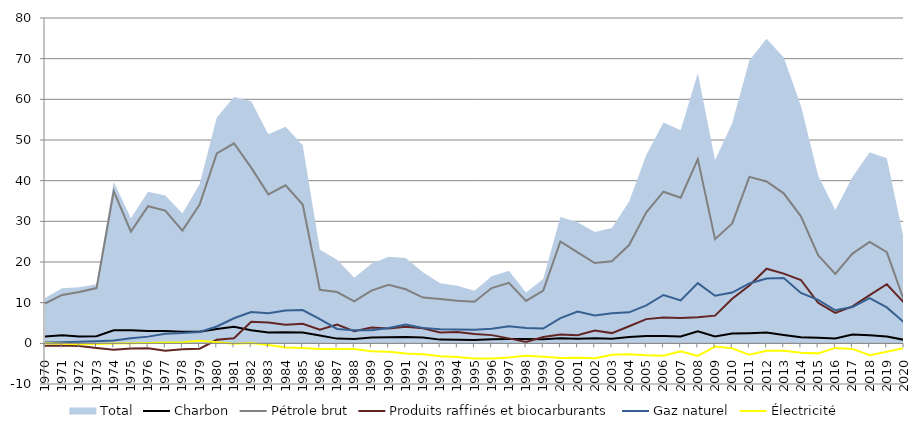
| Category | Charbon | Pétrole brut | Produits raffinés et biocarburants | Gaz naturel | Électricité |
|---|---|---|---|---|---|
| 1970.0 | 1.688 | 9.794 | -0.571 | 0.22 | -0.005 |
| 1971.0 | 1.994 | 11.895 | -0.561 | 0.287 | -0.072 |
| 1972.0 | 1.675 | 12.647 | -0.674 | 0.384 | -0.256 |
| 1973.0 | 1.758 | 13.589 | -1.136 | 0.482 | -0.153 |
| 1974.0 | 3.224 | 37.426 | -1.598 | 0.673 | -0.042 |
| 1975.0 | 3.24 | 27.462 | -1.264 | 1.271 | 0.023 |
| 1976.0 | 3.003 | 33.721 | -1.204 | 1.649 | 0.091 |
| 1977.0 | 3.023 | 32.639 | -1.837 | 2.336 | 0.192 |
| 1978.0 | 2.843 | 27.728 | -1.476 | 2.542 | 0.29 |
| 1979.0 | 2.874 | 34.123 | -1.305 | 2.781 | 0.632 |
| 1980.0 | 3.532 | 46.689 | 0.879 | 4.141 | 0.277 |
| 1981.0 | 4.09 | 49.192 | 1.265 | 6.165 | -0.118 |
| 1982.0 | 3.236 | 43.207 | 5.294 | 7.697 | 0.099 |
| 1983.0 | 2.66 | 36.626 | 5.13 | 7.372 | -0.394 |
| 1984.0 | 2.719 | 38.859 | 4.599 | 8.055 | -0.997 |
| 1985.0 | 2.665 | 34.135 | 4.831 | 8.171 | -1.12 |
| 1986.0 | 1.929 | 13.148 | 3.343 | 5.941 | -1.368 |
| 1987.0 | 1.162 | 12.601 | 4.645 | 3.534 | -1.391 |
| 1988.0 | 1.039 | 10.296 | 2.979 | 3.194 | -1.377 |
| 1989.0 | 1.439 | 12.954 | 3.888 | 3.227 | -1.96 |
| 1990.0 | 1.508 | 14.371 | 3.678 | 3.771 | -2.055 |
| 1991.0 | 1.544 | 13.297 | 4.077 | 4.619 | -2.529 |
| 1992.0 | 1.429 | 11.251 | 3.691 | 3.801 | -2.664 |
| 1993.0 | 0.913 | 10.887 | 2.684 | 3.467 | -3.173 |
| 1994.0 | 0.9 | 10.494 | 2.787 | 3.385 | -3.381 |
| 1995.0 | 0.848 | 10.225 | 2.288 | 3.314 | -3.738 |
| 1996.0 | 0.979 | 13.592 | 2.019 | 3.588 | -3.711 |
| 1997.0 | 1.042 | 14.876 | 1.222 | 4.182 | -3.485 |
| 1998.0 | 1.044 | 10.423 | 0.34 | 3.778 | -3.079 |
| 1999.0 | 1.007 | 12.963 | 1.571 | 3.629 | -3.326 |
| 2000.0 | 1.275 | 25.043 | 2.144 | 6.194 | -3.598 |
| 2001.0 | 1.127 | 22.357 | 1.989 | 7.831 | -3.515 |
| 2002.0 | 1.256 | 19.754 | 3.169 | 6.826 | -3.657 |
| 2003.0 | 1.104 | 20.162 | 2.515 | 7.385 | -2.795 |
| 2004.0 | 1.545 | 24.172 | 4.206 | 7.624 | -2.658 |
| 2005.0 | 1.782 | 32.214 | 5.954 | 9.324 | -2.957 |
| 2006.0 | 1.828 | 37.286 | 6.368 | 11.882 | -3.037 |
| 2007.0 | 1.671 | 35.805 | 6.26 | 10.569 | -1.937 |
| 2008.0 | 2.986 | 45.294 | 6.41 | 14.799 | -3.104 |
| 2009.0 | 1.682 | 25.607 | 6.808 | 11.692 | -0.79 |
| 2010.0 | 2.392 | 29.494 | 10.944 | 12.487 | -1.206 |
| 2011.0 | 2.493 | 40.938 | 14.227 | 14.717 | -2.825 |
| 2012.0 | 2.637 | 39.801 | 18.349 | 15.962 | -1.826 |
| 2013.0 | 2.057 | 36.887 | 17.138 | 16.059 | -1.833 |
| 2014.0 | 1.517 | 31.22 | 15.579 | 12.377 | -2.299 |
| 2015.0 | 1.36 | 21.703 | 9.965 | 10.711 | -2.469 |
| 2016.0 | 1.199 | 17.061 | 7.499 | 8.126 | -1.127 |
| 2017.0 | 2.154 | 22.06 | 9.094 | 8.913 | -1.366 |
| 2018.0 | 1.967 | 24.947 | 11.857 | 11.09 | -2.945 |
| 2019.0 | 1.679 | 22.431 | 14.524 | 8.824 | -2.064 |
| 2020.0 | 0.862 | 10.5 | 9.989 | 5.148 | -1.161 |